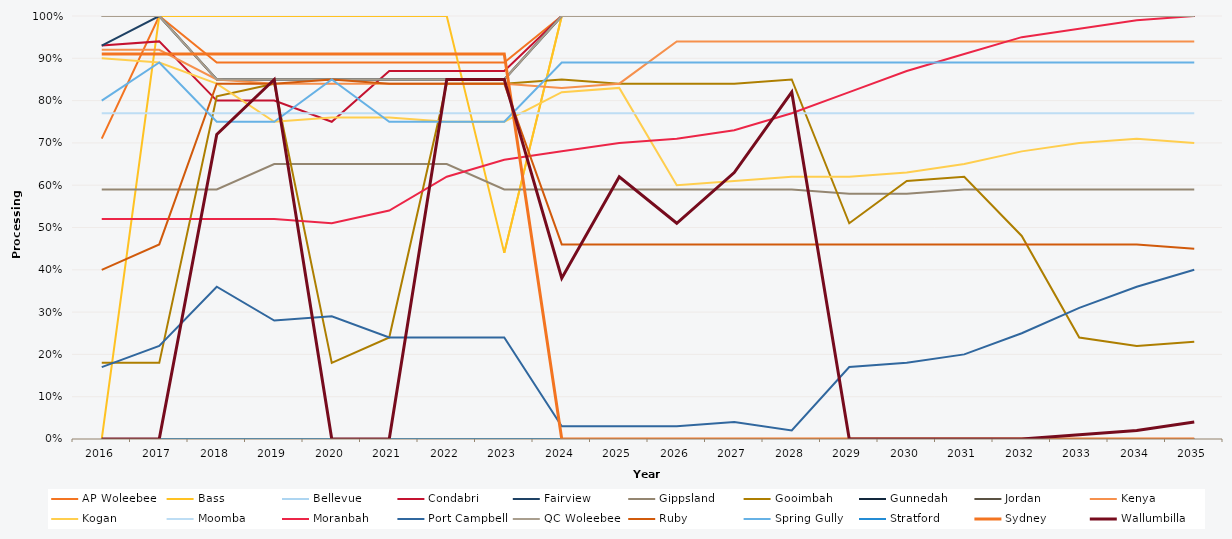
| Category | AP Woleebee | Bass | Bellevue | Condabri | Fairview | Gippsland | Gooimbah | Gunnedah | Jordan | Kenya | Kogan | Moomba | Moranbah | Port Campbell | QC Woleebee | Ruby | Spring Gully | Stratford | Sydney | Wallumbilla |
|---|---|---|---|---|---|---|---|---|---|---|---|---|---|---|---|---|---|---|---|---|
| 2016.0 | 0.71 | 0 | 1 | 0.93 | 0.93 | 0.59 | 0.18 | 0 | 1 | 0.92 | 0.9 | 0.77 | 0.52 | 0.17 | 1 | 0.4 | 0.8 | 0 | 0.91 | 0 |
| 2017.0 | 1 | 1 | 1 | 0.94 | 1 | 0.59 | 0.18 | 0 | 1 | 0.92 | 0.89 | 0.77 | 0.52 | 0.22 | 1 | 0.46 | 0.89 | 0 | 0.91 | 0 |
| 2018.0 | 0.89 | 1 | 0.85 | 0.8 | 0.85 | 0.59 | 0.81 | 0 | 0.85 | 0.85 | 0.84 | 0.77 | 0.52 | 0.36 | 0.85 | 0.84 | 0.75 | 0 | 0.91 | 0.72 |
| 2019.0 | 0.89 | 1 | 0.85 | 0.8 | 0.85 | 0.65 | 0.84 | 0 | 0.85 | 0.84 | 0.75 | 0.77 | 0.52 | 0.28 | 0.85 | 0.84 | 0.75 | 0 | 0.91 | 0.85 |
| 2020.0 | 0.89 | 1 | 0.85 | 0.75 | 0.85 | 0.65 | 0.18 | 0 | 0.85 | 0.84 | 0.76 | 0.77 | 0.51 | 0.29 | 0.85 | 0.85 | 0.85 | 0 | 0.91 | 0 |
| 2021.0 | 0.89 | 1 | 0.85 | 0.87 | 0.85 | 0.65 | 0.24 | 0 | 0.85 | 0.84 | 0.76 | 0.77 | 0.54 | 0.24 | 0.85 | 0.84 | 0.75 | 0 | 0.91 | 0 |
| 2022.0 | 0.89 | 1 | 0.85 | 0.87 | 0.85 | 0.65 | 0.84 | 0 | 0.85 | 0.84 | 0.75 | 0.77 | 0.62 | 0.24 | 0.85 | 0.84 | 0.75 | 0 | 0.91 | 0.85 |
| 2023.0 | 0.89 | 0.44 | 0.85 | 0.87 | 0.85 | 0.59 | 0.84 | 0 | 0.85 | 0.84 | 0.75 | 0.77 | 0.66 | 0.24 | 0.85 | 0.84 | 0.75 | 0 | 0.91 | 0.85 |
| 2024.0 | 1 | 1 | 1 | 1 | 1 | 0.59 | 0.85 | 0 | 1 | 0.83 | 0.82 | 0.77 | 0.68 | 0.03 | 1 | 0.46 | 0.89 | 0 | 0 | 0.38 |
| 2025.0 | 1 | 1 | 1 | 1 | 1 | 0.59 | 0.84 | 0 | 1 | 0.84 | 0.83 | 0.77 | 0.7 | 0.03 | 1 | 0.46 | 0.89 | 0 | 0 | 0.62 |
| 2026.0 | 1 | 1 | 1 | 1 | 1 | 0.59 | 0.84 | 0 | 1 | 0.94 | 0.6 | 0.77 | 0.71 | 0.03 | 1 | 0.46 | 0.89 | 0 | 0 | 0.51 |
| 2027.0 | 1 | 1 | 1 | 1 | 1 | 0.59 | 0.84 | 0 | 1 | 0.94 | 0.61 | 0.77 | 0.73 | 0.04 | 1 | 0.46 | 0.89 | 0 | 0 | 0.63 |
| 2028.0 | 1 | 1 | 1 | 1 | 1 | 0.59 | 0.85 | 0 | 1 | 0.94 | 0.62 | 0.77 | 0.77 | 0.02 | 1 | 0.46 | 0.89 | 0 | 0 | 0.82 |
| 2029.0 | 1 | 1 | 1 | 1 | 1 | 0.58 | 0.51 | 0 | 1 | 0.94 | 0.62 | 0.77 | 0.82 | 0.17 | 1 | 0.46 | 0.89 | 0 | 0 | 0 |
| 2030.0 | 1 | 1 | 1 | 1 | 1 | 0.58 | 0.61 | 0 | 1 | 0.94 | 0.63 | 0.77 | 0.87 | 0.18 | 1 | 0.46 | 0.89 | 0 | 0 | 0 |
| 2031.0 | 1 | 1 | 1 | 1 | 1 | 0.59 | 0.62 | 0 | 1 | 0.94 | 0.65 | 0.77 | 0.91 | 0.2 | 1 | 0.46 | 0.89 | 0 | 0 | 0 |
| 2032.0 | 1 | 1 | 1 | 1 | 1 | 0.59 | 0.48 | 0 | 1 | 0.94 | 0.68 | 0.77 | 0.95 | 0.25 | 1 | 0.46 | 0.89 | 0 | 0 | 0 |
| 2033.0 | 1 | 1 | 1 | 1 | 1 | 0.59 | 0.24 | 0 | 1 | 0.94 | 0.7 | 0.77 | 0.97 | 0.31 | 1 | 0.46 | 0.89 | 0 | 0 | 0.01 |
| 2034.0 | 1 | 1 | 1 | 1 | 1 | 0.59 | 0.22 | 0 | 1 | 0.94 | 0.71 | 0.77 | 0.99 | 0.36 | 1 | 0.46 | 0.89 | 0 | 0 | 0.02 |
| 2035.0 | 1 | 1 | 1 | 1 | 1 | 0.59 | 0.23 | 0 | 1 | 0.94 | 0.7 | 0.77 | 1 | 0.4 | 1 | 0.45 | 0.89 | 0 | 0 | 0.04 |